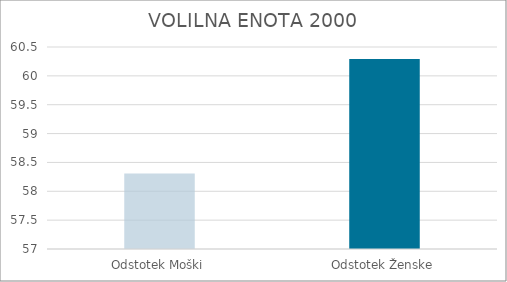
| Category | Series 0 |
|---|---|
| Odstotek Moški | 58.31 |
| Odstotek Ženske | 60.29 |